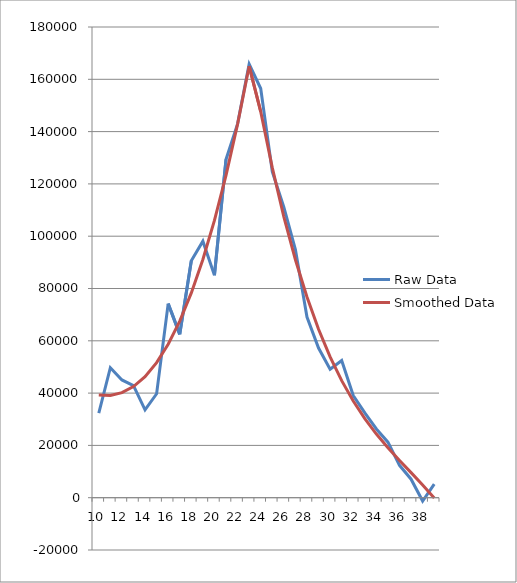
| Category | Raw Data | Smoothed Data |
|---|---|---|
| 10.0 | 32311.5 | 39306.061 |
| 11.0 | 49697 | 39130.106 |
| 12.0 | 45038.8 | 40159.792 |
| 13.0 | 42861.2 | 42513.771 |
| 14.0 | 33601.1 | 46310.7 |
| 15.0 | 39739.3 | 51669.233 |
| 16.0 | 74214.2 | 58708.024 |
| 17.0 | 62466.5 | 67545.73 |
| 18.0 | 90599 | 78301.003 |
| 19.0 | 98097.3 | 91092.5 |
| 20.0 | 85074 | 106038.875 |
| 21.0 | 129359 | 123258.782 |
| 22.0 | 142953 | 142870.878 |
| 23.0 | 165821 | 164993.815 |
| 24.0 | 156476 | 147650.325 |
| 25.0 | 124679 | 126231.361 |
| 26.0 | 111085 | 107418.918 |
| 27.0 | 94841.4 | 90992.95 |
| 28.0 | 69076.8 | 76733.41 |
| 29.0 | 57223.4 | 64420.251 |
| 30.0 | 49140.2 | 53833.427 |
| 31.0 | 52473.6 | 44752.892 |
| 32.0 | 39062.7 | 36958.6 |
| 33.0 | 32410.1 | 30230.504 |
| 34.0 | 26286.1 | 24348.557 |
| 35.0 | 21240.3 | 19092.713 |
| 36.0 | 12389 | 14242.926 |
| 37.0 | 7075.41 | 9579.15 |
| 38.0 | -1289.64 | 4881.338 |
| 39.0 | 5165.61 | -70.557 |